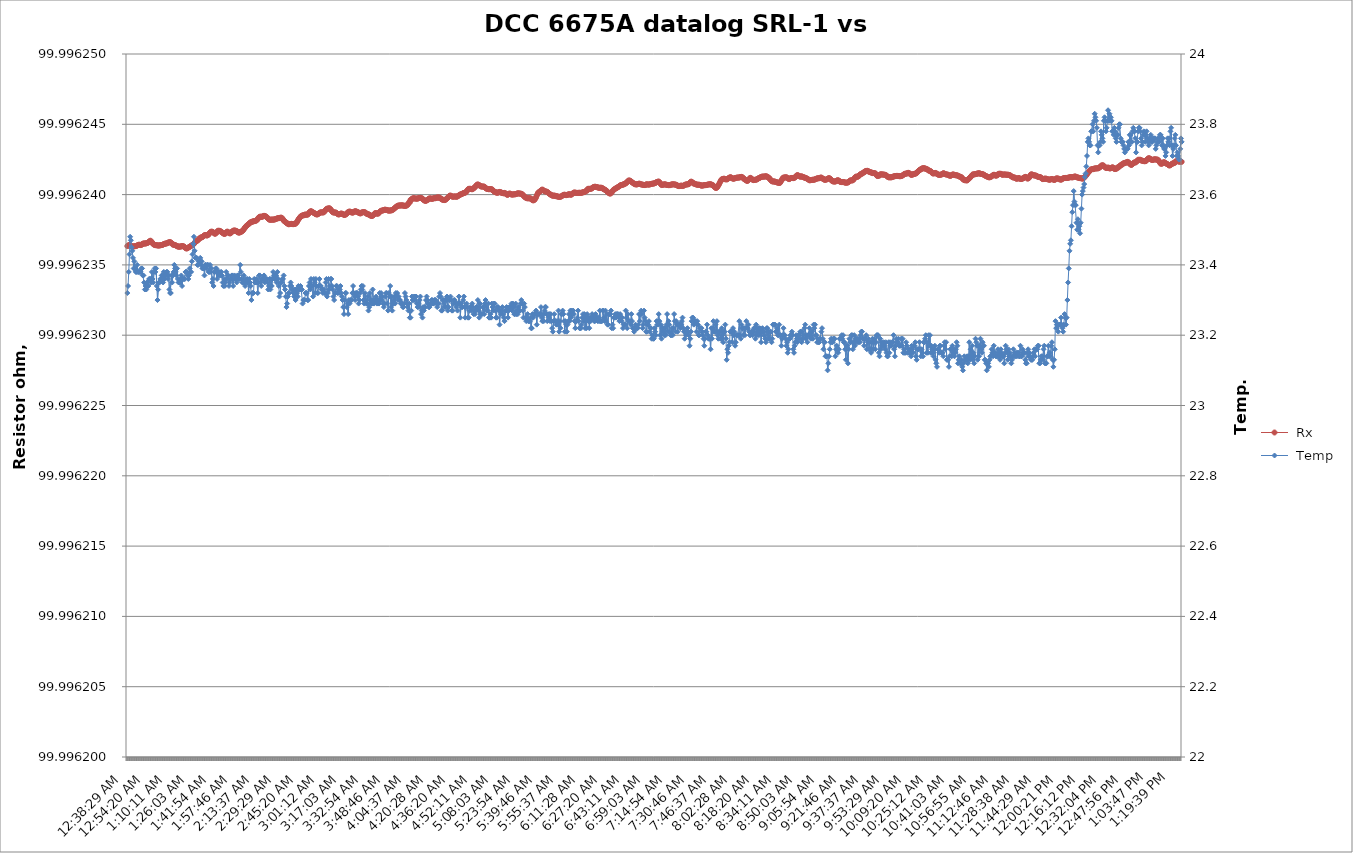
| Category |  Rx |
|---|---|
| 2021-03-07 00:38:29 | 99.996 |
| 2021-03-07 00:38:59 | 99.996 |
| 2021-03-07 00:39:30 | 99.996 |
| 2021-03-07 00:40:01 | 99.996 |
| 2021-03-07 00:40:31 | 99.996 |
| 2021-03-07 00:41:02 | 99.996 |
| 2021-03-07 00:41:33 | 99.996 |
| 2021-03-07 00:42:03 | 99.996 |
| 2021-03-07 00:42:34 | 99.996 |
| 2021-03-07 00:43:05 | 99.996 |
| 2021-03-07 00:43:35 | 99.996 |
| 2021-03-07 00:44:06 | 99.996 |
| 2021-03-07 00:44:37 | 99.996 |
| 2021-03-07 00:45:08 | 99.996 |
| 2021-03-07 00:45:38 | 99.996 |
| 2021-03-07 00:46:09 | 99.996 |
| 2021-03-07 00:46:40 | 99.996 |
| 2021-03-07 00:47:10 | 99.996 |
| 2021-03-07 00:47:41 | 99.996 |
| 2021-03-07 00:48:12 | 99.996 |
| 2021-03-07 00:48:42 | 99.996 |
| 2021-03-07 00:49:13 | 99.996 |
| 2021-03-07 00:49:44 | 99.996 |
| 2021-03-07 00:50:14 | 99.996 |
| 2021-03-07 00:50:45 | 99.996 |
| 2021-03-07 00:51:16 | 99.996 |
| 2021-03-07 00:51:47 | 99.996 |
| 2021-03-07 00:52:17 | 99.996 |
| 2021-03-07 00:52:48 | 99.996 |
| 2021-03-07 00:53:19 | 99.996 |
| 2021-03-07 00:53:49 | 99.996 |
| 2021-03-07 00:54:20 | 99.996 |
| 2021-03-07 00:54:51 | 99.996 |
| 2021-03-07 00:55:21 | 99.996 |
| 2021-03-07 00:55:52 | 99.996 |
| 2021-03-07 00:56:23 | 99.996 |
| 2021-03-07 00:56:53 | 99.996 |
| 2021-03-07 00:57:24 | 99.996 |
| 2021-03-07 00:57:55 | 99.996 |
| 2021-03-07 00:58:26 | 99.996 |
| 2021-03-07 00:58:56 | 99.996 |
| 2021-03-07 00:59:27 | 99.996 |
| 2021-03-07 00:59:58 | 99.996 |
| 2021-03-07 01:00:28 | 99.996 |
| 2021-03-07 01:00:59 | 99.996 |
| 2021-03-07 01:01:30 | 99.996 |
| 2021-03-07 01:02:00 | 99.996 |
| 2021-03-07 01:02:31 | 99.996 |
| 2021-03-07 01:03:02 | 99.996 |
| 2021-03-07 01:03:32 | 99.996 |
| 2021-03-07 01:04:03 | 99.996 |
| 2021-03-07 01:04:34 | 99.996 |
| 2021-03-07 01:05:05 | 99.996 |
| 2021-03-07 01:05:35 | 99.996 |
| 2021-03-07 01:06:06 | 99.996 |
| 2021-03-07 01:06:37 | 99.996 |
| 2021-03-07 01:07:07 | 99.996 |
| 2021-03-07 01:07:38 | 99.996 |
| 2021-03-07 01:08:09 | 99.996 |
| 2021-03-07 01:08:39 | 99.996 |
| 2021-03-07 01:09:10 | 99.996 |
| 2021-03-07 01:09:41 | 99.996 |
| 2021-03-07 01:10:11 | 99.996 |
| 2021-03-07 01:10:42 | 99.996 |
| 2021-03-07 01:11:13 | 99.996 |
| 2021-03-07 01:11:44 | 99.996 |
| 2021-03-07 01:12:14 | 99.996 |
| 2021-03-07 01:12:45 | 99.996 |
| 2021-03-07 01:13:16 | 99.996 |
| 2021-03-07 01:13:46 | 99.996 |
| 2021-03-07 01:14:17 | 99.996 |
| 2021-03-07 01:14:48 | 99.996 |
| 2021-03-07 01:15:18 | 99.996 |
| 2021-03-07 01:15:49 | 99.996 |
| 2021-03-07 01:16:20 | 99.996 |
| 2021-03-07 01:16:51 | 99.996 |
| 2021-03-07 01:17:21 | 99.996 |
| 2021-03-07 01:17:52 | 99.996 |
| 2021-03-07 01:18:23 | 99.996 |
| 2021-03-07 01:18:53 | 99.996 |
| 2021-03-07 01:19:24 | 99.996 |
| 2021-03-07 01:19:55 | 99.996 |
| 2021-03-07 01:20:25 | 99.996 |
| 2021-03-07 01:20:56 | 99.996 |
| 2021-03-07 01:21:27 | 99.996 |
| 2021-03-07 01:21:57 | 99.996 |
| 2021-03-07 01:22:28 | 99.996 |
| 2021-03-07 01:22:59 | 99.996 |
| 2021-03-07 01:23:30 | 99.996 |
| 2021-03-07 01:24:00 | 99.996 |
| 2021-03-07 01:24:31 | 99.996 |
| 2021-03-07 01:25:02 | 99.996 |
| 2021-03-07 01:25:32 | 99.996 |
| 2021-03-07 01:26:03 | 99.996 |
| 2021-03-07 01:26:34 | 99.996 |
| 2021-03-07 01:27:04 | 99.996 |
| 2021-03-07 01:27:35 | 99.996 |
| 2021-03-07 01:28:06 | 99.996 |
| 2021-03-07 01:28:36 | 99.996 |
| 2021-03-07 01:29:07 | 99.996 |
| 2021-03-07 01:29:38 | 99.996 |
| 2021-03-07 01:30:09 | 99.996 |
| 2021-03-07 01:30:39 | 99.996 |
| 2021-03-07 01:31:10 | 99.996 |
| 2021-03-07 01:31:41 | 99.996 |
| 2021-03-07 01:32:11 | 99.996 |
| 2021-03-07 01:32:42 | 99.996 |
| 2021-03-07 01:33:13 | 99.996 |
| 2021-03-07 01:33:43 | 99.996 |
| 2021-03-07 01:34:14 | 99.996 |
| 2021-03-07 01:34:45 | 99.996 |
| 2021-03-07 01:35:15 | 99.996 |
| 2021-03-07 01:35:46 | 99.996 |
| 2021-03-07 01:36:17 | 99.996 |
| 2021-03-07 01:36:48 | 99.996 |
| 2021-03-07 01:37:18 | 99.996 |
| 2021-03-07 01:37:49 | 99.996 |
| 2021-03-07 01:38:20 | 99.996 |
| 2021-03-07 01:38:50 | 99.996 |
| 2021-03-07 01:39:21 | 99.996 |
| 2021-03-07 01:39:52 | 99.996 |
| 2021-03-07 01:40:22 | 99.996 |
| 2021-03-07 01:40:53 | 99.996 |
| 2021-03-07 01:41:24 | 99.996 |
| 2021-03-07 01:41:54 | 99.996 |
| 2021-03-07 01:42:25 | 99.996 |
| 2021-03-07 01:42:56 | 99.996 |
| 2021-03-07 01:43:27 | 99.996 |
| 2021-03-07 01:43:57 | 99.996 |
| 2021-03-07 01:44:28 | 99.996 |
| 2021-03-07 01:44:59 | 99.996 |
| 2021-03-07 01:45:29 | 99.996 |
| 2021-03-07 01:46:00 | 99.996 |
| 2021-03-07 01:46:31 | 99.996 |
| 2021-03-07 01:47:01 | 99.996 |
| 2021-03-07 01:47:32 | 99.996 |
| 2021-03-07 01:48:03 | 99.996 |
| 2021-03-07 01:48:33 | 99.996 |
| 2021-03-07 01:49:04 | 99.996 |
| 2021-03-07 01:49:35 | 99.996 |
| 2021-03-07 01:50:06 | 99.996 |
| 2021-03-07 01:50:36 | 99.996 |
| 2021-03-07 01:51:07 | 99.996 |
| 2021-03-07 01:51:38 | 99.996 |
| 2021-03-07 01:52:08 | 99.996 |
| 2021-03-07 01:52:39 | 99.996 |
| 2021-03-07 01:53:10 | 99.996 |
| 2021-03-07 01:53:40 | 99.996 |
| 2021-03-07 01:54:11 | 99.996 |
| 2021-03-07 01:54:42 | 99.996 |
| 2021-03-07 01:55:12 | 99.996 |
| 2021-03-07 01:55:43 | 99.996 |
| 2021-03-07 01:56:14 | 99.996 |
| 2021-03-07 01:56:44 | 99.996 |
| 2021-03-07 01:57:15 | 99.996 |
| 2021-03-07 01:57:46 | 99.996 |
| 2021-03-07 01:58:17 | 99.996 |
| 2021-03-07 01:58:47 | 99.996 |
| 2021-03-07 01:59:18 | 99.996 |
| 2021-03-07 01:59:49 | 99.996 |
| 2021-03-07 02:00:19 | 99.996 |
| 2021-03-07 02:00:50 | 99.996 |
| 2021-03-07 02:01:21 | 99.996 |
| 2021-03-07 02:01:51 | 99.996 |
| 2021-03-07 02:02:22 | 99.996 |
| 2021-03-07 02:02:53 | 99.996 |
| 2021-03-07 02:03:23 | 99.996 |
| 2021-03-07 02:03:54 | 99.996 |
| 2021-03-07 02:04:25 | 99.996 |
| 2021-03-07 02:04:56 | 99.996 |
| 2021-03-07 02:05:26 | 99.996 |
| 2021-03-07 02:05:57 | 99.996 |
| 2021-03-07 02:06:28 | 99.996 |
| 2021-03-07 02:06:58 | 99.996 |
| 2021-03-07 02:07:29 | 99.996 |
| 2021-03-07 02:08:00 | 99.996 |
| 2021-03-07 02:08:30 | 99.996 |
| 2021-03-07 02:09:01 | 99.996 |
| 2021-03-07 02:09:32 | 99.996 |
| 2021-03-07 02:10:02 | 99.996 |
| 2021-03-07 02:10:33 | 99.996 |
| 2021-03-07 02:11:04 | 99.996 |
| 2021-03-07 02:11:35 | 99.996 |
| 2021-03-07 02:12:05 | 99.996 |
| 2021-03-07 02:12:36 | 99.996 |
| 2021-03-07 02:13:07 | 99.996 |
| 2021-03-07 02:13:37 | 99.996 |
| 2021-03-07 02:14:08 | 99.996 |
| 2021-03-07 02:14:39 | 99.996 |
| 2021-03-07 02:15:09 | 99.996 |
| 2021-03-07 02:15:40 | 99.996 |
| 2021-03-07 02:16:11 | 99.996 |
| 2021-03-07 02:16:41 | 99.996 |
| 2021-03-07 02:17:12 | 99.996 |
| 2021-03-07 02:17:43 | 99.996 |
| 2021-03-07 02:18:14 | 99.996 |
| 2021-03-07 02:18:44 | 99.996 |
| 2021-03-07 02:19:15 | 99.996 |
| 2021-03-07 02:19:46 | 99.996 |
| 2021-03-07 02:20:16 | 99.996 |
| 2021-03-07 02:20:47 | 99.996 |
| 2021-03-07 02:21:18 | 99.996 |
| 2021-03-07 02:21:48 | 99.996 |
| 2021-03-07 02:22:19 | 99.996 |
| 2021-03-07 02:22:50 | 99.996 |
| 2021-03-07 02:23:20 | 99.996 |
| 2021-03-07 02:23:51 | 99.996 |
| 2021-03-07 02:24:22 | 99.996 |
| 2021-03-07 02:24:52 | 99.996 |
| 2021-03-07 02:25:23 | 99.996 |
| 2021-03-07 02:25:54 | 99.996 |
| 2021-03-07 02:26:25 | 99.996 |
| 2021-03-07 02:26:55 | 99.996 |
| 2021-03-07 02:27:26 | 99.996 |
| 2021-03-07 02:27:57 | 99.996 |
| 2021-03-07 02:28:27 | 99.996 |
| 2021-03-07 02:28:58 | 99.996 |
| 2021-03-07 02:29:29 | 99.996 |
| 2021-03-07 02:29:59 | 99.996 |
| 2021-03-07 02:30:30 | 99.996 |
| 2021-03-07 02:31:01 | 99.996 |
| 2021-03-07 02:31:31 | 99.996 |
| 2021-03-07 02:32:02 | 99.996 |
| 2021-03-07 02:32:33 | 99.996 |
| 2021-03-07 02:33:04 | 99.996 |
| 2021-03-07 02:33:34 | 99.996 |
| 2021-03-07 02:34:05 | 99.996 |
| 2021-03-07 02:34:36 | 99.996 |
| 2021-03-07 02:35:06 | 99.996 |
| 2021-03-07 02:35:37 | 99.996 |
| 2021-03-07 02:36:08 | 99.996 |
| 2021-03-07 02:36:38 | 99.996 |
| 2021-03-07 02:37:09 | 99.996 |
| 2021-03-07 02:37:40 | 99.996 |
| 2021-03-07 02:38:10 | 99.996 |
| 2021-03-07 02:38:41 | 99.996 |
| 2021-03-07 02:39:12 | 99.996 |
| 2021-03-07 02:39:43 | 99.996 |
| 2021-03-07 02:40:13 | 99.996 |
| 2021-03-07 02:40:44 | 99.996 |
| 2021-03-07 02:41:15 | 99.996 |
| 2021-03-07 02:41:45 | 99.996 |
| 2021-03-07 02:42:16 | 99.996 |
| 2021-03-07 02:42:47 | 99.996 |
| 2021-03-07 02:43:17 | 99.996 |
| 2021-03-07 02:43:48 | 99.996 |
| 2021-03-07 02:44:19 | 99.996 |
| 2021-03-07 02:44:49 | 99.996 |
| 2021-03-07 02:45:20 | 99.996 |
| 2021-03-07 02:45:51 | 99.996 |
| 2021-03-07 02:46:22 | 99.996 |
| 2021-03-07 02:46:52 | 99.996 |
| 2021-03-07 02:47:23 | 99.996 |
| 2021-03-07 02:47:54 | 99.996 |
| 2021-03-07 02:48:24 | 99.996 |
| 2021-03-07 02:48:55 | 99.996 |
| 2021-03-07 02:49:26 | 99.996 |
| 2021-03-07 02:49:56 | 99.996 |
| 2021-03-07 02:50:27 | 99.996 |
| 2021-03-07 02:50:58 | 99.996 |
| 2021-03-07 02:51:28 | 99.996 |
| 2021-03-07 02:51:59 | 99.996 |
| 2021-03-07 02:52:30 | 99.996 |
| 2021-03-07 02:53:00 | 99.996 |
| 2021-03-07 02:53:31 | 99.996 |
| 2021-03-07 02:54:02 | 99.996 |
| 2021-03-07 02:54:33 | 99.996 |
| 2021-03-07 02:55:03 | 99.996 |
| 2021-03-07 02:55:34 | 99.996 |
| 2021-03-07 02:56:05 | 99.996 |
| 2021-03-07 02:56:35 | 99.996 |
| 2021-03-07 02:57:06 | 99.996 |
| 2021-03-07 02:57:37 | 99.996 |
| 2021-03-07 02:58:07 | 99.996 |
| 2021-03-07 02:58:38 | 99.996 |
| 2021-03-07 02:59:09 | 99.996 |
| 2021-03-07 02:59:39 | 99.996 |
| 2021-03-07 03:00:10 | 99.996 |
| 2021-03-07 03:00:41 | 99.996 |
| 2021-03-07 03:01:12 | 99.996 |
| 2021-03-07 03:01:42 | 99.996 |
| 2021-03-07 03:02:13 | 99.996 |
| 2021-03-07 03:02:44 | 99.996 |
| 2021-03-07 03:03:14 | 99.996 |
| 2021-03-07 03:03:45 | 99.996 |
| 2021-03-07 03:04:16 | 99.996 |
| 2021-03-07 03:04:46 | 99.996 |
| 2021-03-07 03:05:17 | 99.996 |
| 2021-03-07 03:05:48 | 99.996 |
| 2021-03-07 03:06:18 | 99.996 |
| 2021-03-07 03:06:49 | 99.996 |
| 2021-03-07 03:07:20 | 99.996 |
| 2021-03-07 03:07:50 | 99.996 |
| 2021-03-07 03:08:21 | 99.996 |
| 2021-03-07 03:08:52 | 99.996 |
| 2021-03-07 03:09:23 | 99.996 |
| 2021-03-07 03:09:53 | 99.996 |
| 2021-03-07 03:10:24 | 99.996 |
| 2021-03-07 03:10:55 | 99.996 |
| 2021-03-07 03:11:25 | 99.996 |
| 2021-03-07 03:11:56 | 99.996 |
| 2021-03-07 03:12:27 | 99.996 |
| 2021-03-07 03:12:57 | 99.996 |
| 2021-03-07 03:13:28 | 99.996 |
| 2021-03-07 03:13:59 | 99.996 |
| 2021-03-07 03:14:29 | 99.996 |
| 2021-03-07 03:15:00 | 99.996 |
| 2021-03-07 03:15:31 | 99.996 |
| 2021-03-07 03:16:02 | 99.996 |
| 2021-03-07 03:16:32 | 99.996 |
| 2021-03-07 03:17:03 | 99.996 |
| 2021-03-07 03:17:34 | 99.996 |
| 2021-03-07 03:18:04 | 99.996 |
| 2021-03-07 03:18:35 | 99.996 |
| 2021-03-07 03:19:06 | 99.996 |
| 2021-03-07 03:19:36 | 99.996 |
| 2021-03-07 03:20:07 | 99.996 |
| 2021-03-07 03:20:38 | 99.996 |
| 2021-03-07 03:21:08 | 99.996 |
| 2021-03-07 03:21:39 | 99.996 |
| 2021-03-07 03:22:10 | 99.996 |
| 2021-03-07 03:22:41 | 99.996 |
| 2021-03-07 03:23:11 | 99.996 |
| 2021-03-07 03:23:42 | 99.996 |
| 2021-03-07 03:24:13 | 99.996 |
| 2021-03-07 03:24:43 | 99.996 |
| 2021-03-07 03:25:14 | 99.996 |
| 2021-03-07 03:25:45 | 99.996 |
| 2021-03-07 03:26:15 | 99.996 |
| 2021-03-07 03:26:46 | 99.996 |
| 2021-03-07 03:27:17 | 99.996 |
| 2021-03-07 03:27:47 | 99.996 |
| 2021-03-07 03:28:18 | 99.996 |
| 2021-03-07 03:28:49 | 99.996 |
| 2021-03-07 03:29:19 | 99.996 |
| 2021-03-07 03:29:50 | 99.996 |
| 2021-03-07 03:30:21 | 99.996 |
| 2021-03-07 03:30:52 | 99.996 |
| 2021-03-07 03:31:22 | 99.996 |
| 2021-03-07 03:31:53 | 99.996 |
| 2021-03-07 03:32:24 | 99.996 |
| 2021-03-07 03:32:54 | 99.996 |
| 2021-03-07 03:33:25 | 99.996 |
| 2021-03-07 03:33:56 | 99.996 |
| 2021-03-07 03:34:26 | 99.996 |
| 2021-03-07 03:34:57 | 99.996 |
| 2021-03-07 03:35:28 | 99.996 |
| 2021-03-07 03:35:58 | 99.996 |
| 2021-03-07 03:36:29 | 99.996 |
| 2021-03-07 03:37:00 | 99.996 |
| 2021-03-07 03:37:30 | 99.996 |
| 2021-03-07 03:38:01 | 99.996 |
| 2021-03-07 03:38:32 | 99.996 |
| 2021-03-07 03:39:03 | 99.996 |
| 2021-03-07 03:39:33 | 99.996 |
| 2021-03-07 03:40:04 | 99.996 |
| 2021-03-07 03:40:35 | 99.996 |
| 2021-03-07 03:41:05 | 99.996 |
| 2021-03-07 03:41:36 | 99.996 |
| 2021-03-07 03:42:07 | 99.996 |
| 2021-03-07 03:42:37 | 99.996 |
| 2021-03-07 03:43:08 | 99.996 |
| 2021-03-07 03:43:39 | 99.996 |
| 2021-03-07 03:44:09 | 99.996 |
| 2021-03-07 03:44:40 | 99.996 |
| 2021-03-07 03:45:11 | 99.996 |
| 2021-03-07 03:45:42 | 99.996 |
| 2021-03-07 03:46:12 | 99.996 |
| 2021-03-07 03:46:43 | 99.996 |
| 2021-03-07 03:47:14 | 99.996 |
| 2021-03-07 03:47:44 | 99.996 |
| 2021-03-07 03:48:15 | 99.996 |
| 2021-03-07 03:48:46 | 99.996 |
| 2021-03-07 03:49:16 | 99.996 |
| 2021-03-07 03:49:47 | 99.996 |
| 2021-03-07 03:50:18 | 99.996 |
| 2021-03-07 03:50:48 | 99.996 |
| 2021-03-07 03:51:19 | 99.996 |
| 2021-03-07 03:51:50 | 99.996 |
| 2021-03-07 03:52:20 | 99.996 |
| 2021-03-07 03:52:51 | 99.996 |
| 2021-03-07 03:53:22 | 99.996 |
| 2021-03-07 03:53:53 | 99.996 |
| 2021-03-07 03:54:23 | 99.996 |
| 2021-03-07 03:54:54 | 99.996 |
| 2021-03-07 03:55:25 | 99.996 |
| 2021-03-07 03:55:55 | 99.996 |
| 2021-03-07 03:56:26 | 99.996 |
| 2021-03-07 03:56:57 | 99.996 |
| 2021-03-07 03:57:27 | 99.996 |
| 2021-03-07 03:57:58 | 99.996 |
| 2021-03-07 03:58:29 | 99.996 |
| 2021-03-07 03:58:59 | 99.996 |
| 2021-03-07 03:59:30 | 99.996 |
| 2021-03-07 04:00:01 | 99.996 |
| 2021-03-07 04:00:32 | 99.996 |
| 2021-03-07 04:01:02 | 99.996 |
| 2021-03-07 04:01:33 | 99.996 |
| 2021-03-07 04:02:04 | 99.996 |
| 2021-03-07 04:02:34 | 99.996 |
| 2021-03-07 04:03:05 | 99.996 |
| 2021-03-07 04:03:36 | 99.996 |
| 2021-03-07 04:04:06 | 99.996 |
| 2021-03-07 04:04:37 | 99.996 |
| 2021-03-07 04:05:08 | 99.996 |
| 2021-03-07 04:05:38 | 99.996 |
| 2021-03-07 04:06:09 | 99.996 |
| 2021-03-07 04:06:40 | 99.996 |
| 2021-03-07 04:07:11 | 99.996 |
| 2021-03-07 04:07:41 | 99.996 |
| 2021-03-07 04:08:12 | 99.996 |
| 2021-03-07 04:08:43 | 99.996 |
| 2021-03-07 04:09:13 | 99.996 |
| 2021-03-07 04:09:44 | 99.996 |
| 2021-03-07 04:10:15 | 99.996 |
| 2021-03-07 04:10:45 | 99.996 |
| 2021-03-07 04:11:16 | 99.996 |
| 2021-03-07 04:11:47 | 99.996 |
| 2021-03-07 04:12:17 | 99.996 |
| 2021-03-07 04:12:48 | 99.996 |
| 2021-03-07 04:13:19 | 99.996 |
| 2021-03-07 04:13:50 | 99.996 |
| 2021-03-07 04:14:20 | 99.996 |
| 2021-03-07 04:14:51 | 99.996 |
| 2021-03-07 04:15:22 | 99.996 |
| 2021-03-07 04:15:52 | 99.996 |
| 2021-03-07 04:16:23 | 99.996 |
| 2021-03-07 04:16:54 | 99.996 |
| 2021-03-07 04:17:24 | 99.996 |
| 2021-03-07 04:17:55 | 99.996 |
| 2021-03-07 04:18:26 | 99.996 |
| 2021-03-07 04:18:56 | 99.996 |
| 2021-03-07 04:19:27 | 99.996 |
| 2021-03-07 04:19:58 | 99.996 |
| 2021-03-07 04:20:28 | 99.996 |
| 2021-03-07 04:20:59 | 99.996 |
| 2021-03-07 04:21:30 | 99.996 |
| 2021-03-07 04:22:01 | 99.996 |
| 2021-03-07 04:22:31 | 99.996 |
| 2021-03-07 04:23:02 | 99.996 |
| 2021-03-07 04:23:33 | 99.996 |
| 2021-03-07 04:24:03 | 99.996 |
| 2021-03-07 04:24:34 | 99.996 |
| 2021-03-07 04:25:05 | 99.996 |
| 2021-03-07 04:25:35 | 99.996 |
| 2021-03-07 04:26:06 | 99.996 |
| 2021-03-07 04:26:37 | 99.996 |
| 2021-03-07 04:27:07 | 99.996 |
| 2021-03-07 04:27:38 | 99.996 |
| 2021-03-07 04:28:09 | 99.996 |
| 2021-03-07 04:28:40 | 99.996 |
| 2021-03-07 04:29:10 | 99.996 |
| 2021-03-07 04:29:41 | 99.996 |
| 2021-03-07 04:30:12 | 99.996 |
| 2021-03-07 04:30:42 | 99.996 |
| 2021-03-07 04:31:13 | 99.996 |
| 2021-03-07 04:31:44 | 99.996 |
| 2021-03-07 04:32:14 | 99.996 |
| 2021-03-07 04:32:45 | 99.996 |
| 2021-03-07 04:33:16 | 99.996 |
| 2021-03-07 04:33:46 | 99.996 |
| 2021-03-07 04:34:17 | 99.996 |
| 2021-03-07 04:34:48 | 99.996 |
| 2021-03-07 04:35:18 | 99.996 |
| 2021-03-07 04:35:49 | 99.996 |
| 2021-03-07 04:36:20 | 99.996 |
| 2021-03-07 04:36:51 | 99.996 |
| 2021-03-07 04:37:21 | 99.996 |
| 2021-03-07 04:37:52 | 99.996 |
| 2021-03-07 04:38:23 | 99.996 |
| 2021-03-07 04:38:53 | 99.996 |
| 2021-03-07 04:39:24 | 99.996 |
| 2021-03-07 04:39:55 | 99.996 |
| 2021-03-07 04:40:25 | 99.996 |
| 2021-03-07 04:40:56 | 99.996 |
| 2021-03-07 04:41:27 | 99.996 |
| 2021-03-07 04:41:57 | 99.996 |
| 2021-03-07 04:42:28 | 99.996 |
| 2021-03-07 04:42:59 | 99.996 |
| 2021-03-07 04:43:30 | 99.996 |
| 2021-03-07 04:44:00 | 99.996 |
| 2021-03-07 04:44:31 | 99.996 |
| 2021-03-07 04:45:02 | 99.996 |
| 2021-03-07 04:45:32 | 99.996 |
| 2021-03-07 04:46:03 | 99.996 |
| 2021-03-07 04:46:34 | 99.996 |
| 2021-03-07 04:47:04 | 99.996 |
| 2021-03-07 04:47:35 | 99.996 |
| 2021-03-07 04:48:06 | 99.996 |
| 2021-03-07 04:48:36 | 99.996 |
| 2021-03-07 04:49:07 | 99.996 |
| 2021-03-07 04:49:38 | 99.996 |
| 2021-03-07 04:50:09 | 99.996 |
| 2021-03-07 04:50:39 | 99.996 |
| 2021-03-07 04:51:10 | 99.996 |
| 2021-03-07 04:51:41 | 99.996 |
| 2021-03-07 04:52:11 | 99.996 |
| 2021-03-07 04:52:42 | 99.996 |
| 2021-03-07 04:53:13 | 99.996 |
| 2021-03-07 04:53:43 | 99.996 |
| 2021-03-07 04:54:14 | 99.996 |
| 2021-03-07 04:54:45 | 99.996 |
| 2021-03-07 04:55:15 | 99.996 |
| 2021-03-07 04:55:46 | 99.996 |
| 2021-03-07 04:56:17 | 99.996 |
| 2021-03-07 04:56:48 | 99.996 |
| 2021-03-07 04:57:18 | 99.996 |
| 2021-03-07 04:57:49 | 99.996 |
| 2021-03-07 04:58:20 | 99.996 |
| 2021-03-07 04:58:50 | 99.996 |
| 2021-03-07 04:59:21 | 99.996 |
| 2021-03-07 04:59:52 | 99.996 |
| 2021-03-07 05:00:22 | 99.996 |
| 2021-03-07 05:00:53 | 99.996 |
| 2021-03-07 05:01:24 | 99.996 |
| 2021-03-07 05:01:54 | 99.996 |
| 2021-03-07 05:02:25 | 99.996 |
| 2021-03-07 05:02:56 | 99.996 |
| 2021-03-07 05:03:27 | 99.996 |
| 2021-03-07 05:03:57 | 99.996 |
| 2021-03-07 05:04:28 | 99.996 |
| 2021-03-07 05:04:59 | 99.996 |
| 2021-03-07 05:05:29 | 99.996 |
| 2021-03-07 05:06:00 | 99.996 |
| 2021-03-07 05:06:31 | 99.996 |
| 2021-03-07 05:07:01 | 99.996 |
| 2021-03-07 05:07:32 | 99.996 |
| 2021-03-07 05:08:03 | 99.996 |
| 2021-03-07 05:08:33 | 99.996 |
| 2021-03-07 05:09:04 | 99.996 |
| 2021-03-07 05:09:35 | 99.996 |
| 2021-03-07 05:10:05 | 99.996 |
| 2021-03-07 05:10:36 | 99.996 |
| 2021-03-07 05:11:07 | 99.996 |
| 2021-03-07 05:11:38 | 99.996 |
| 2021-03-07 05:12:08 | 99.996 |
| 2021-03-07 05:12:39 | 99.996 |
| 2021-03-07 05:13:10 | 99.996 |
| 2021-03-07 05:13:40 | 99.996 |
| 2021-03-07 05:14:11 | 99.996 |
| 2021-03-07 05:14:42 | 99.996 |
| 2021-03-07 05:15:12 | 99.996 |
| 2021-03-07 05:15:43 | 99.996 |
| 2021-03-07 05:16:14 | 99.996 |
| 2021-03-07 05:16:44 | 99.996 |
| 2021-03-07 05:17:15 | 99.996 |
| 2021-03-07 05:17:46 | 99.996 |
| 2021-03-07 05:18:17 | 99.996 |
| 2021-03-07 05:18:47 | 99.996 |
| 2021-03-07 05:19:18 | 99.996 |
| 2021-03-07 05:19:49 | 99.996 |
| 2021-03-07 05:20:19 | 99.996 |
| 2021-03-07 05:20:50 | 99.996 |
| 2021-03-07 05:21:21 | 99.996 |
| 2021-03-07 05:21:51 | 99.996 |
| 2021-03-07 05:22:22 | 99.996 |
| 2021-03-07 05:22:53 | 99.996 |
| 2021-03-07 05:23:23 | 99.996 |
| 2021-03-07 05:23:54 | 99.996 |
| 2021-03-07 05:24:25 | 99.996 |
| 2021-03-07 05:24:56 | 99.996 |
| 2021-03-07 05:25:26 | 99.996 |
| 2021-03-07 05:25:57 | 99.996 |
| 2021-03-07 05:26:28 | 99.996 |
| 2021-03-07 05:26:58 | 99.996 |
| 2021-03-07 05:27:29 | 99.996 |
| 2021-03-07 05:28:00 | 99.996 |
| 2021-03-07 05:28:30 | 99.996 |
| 2021-03-07 05:29:01 | 99.996 |
| 2021-03-07 05:29:32 | 99.996 |
| 2021-03-07 05:30:02 | 99.996 |
| 2021-03-07 05:30:33 | 99.996 |
| 2021-03-07 05:31:04 | 99.996 |
| 2021-03-07 05:31:34 | 99.996 |
| 2021-03-07 05:32:05 | 99.996 |
| 2021-03-07 05:32:36 | 99.996 |
| 2021-03-07 05:33:07 | 99.996 |
| 2021-03-07 05:33:37 | 99.996 |
| 2021-03-07 05:34:08 | 99.996 |
| 2021-03-07 05:34:39 | 99.996 |
| 2021-03-07 05:35:09 | 99.996 |
| 2021-03-07 05:35:40 | 99.996 |
| 2021-03-07 05:36:11 | 99.996 |
| 2021-03-07 05:36:41 | 99.996 |
| 2021-03-07 05:37:12 | 99.996 |
| 2021-03-07 05:37:43 | 99.996 |
| 2021-03-07 05:38:13 | 99.996 |
| 2021-03-07 05:38:44 | 99.996 |
| 2021-03-07 05:39:15 | 99.996 |
| 2021-03-07 05:39:46 | 99.996 |
| 2021-03-07 05:40:16 | 99.996 |
| 2021-03-07 05:40:47 | 99.996 |
| 2021-03-07 05:41:18 | 99.996 |
| 2021-03-07 05:41:48 | 99.996 |
| 2021-03-07 05:42:19 | 99.996 |
| 2021-03-07 05:42:50 | 99.996 |
| 2021-03-07 05:43:20 | 99.996 |
| 2021-03-07 05:43:51 | 99.996 |
| 2021-03-07 05:44:22 | 99.996 |
| 2021-03-07 05:44:52 | 99.996 |
| 2021-03-07 05:45:23 | 99.996 |
| 2021-03-07 05:45:54 | 99.996 |
| 2021-03-07 05:46:24 | 99.996 |
| 2021-03-07 05:46:55 | 99.996 |
| 2021-03-07 05:47:26 | 99.996 |
| 2021-03-07 05:47:57 | 99.996 |
| 2021-03-07 05:48:27 | 99.996 |
| 2021-03-07 05:48:58 | 99.996 |
| 2021-03-07 05:49:29 | 99.996 |
| 2021-03-07 05:49:59 | 99.996 |
| 2021-03-07 05:50:30 | 99.996 |
| 2021-03-07 05:51:01 | 99.996 |
| 2021-03-07 05:51:31 | 99.996 |
| 2021-03-07 05:52:02 | 99.996 |
| 2021-03-07 05:52:33 | 99.996 |
| 2021-03-07 05:53:03 | 99.996 |
| 2021-03-07 05:53:34 | 99.996 |
| 2021-03-07 05:54:05 | 99.996 |
| 2021-03-07 05:54:36 | 99.996 |
| 2021-03-07 05:55:06 | 99.996 |
| 2021-03-07 05:55:37 | 99.996 |
| 2021-03-07 05:56:08 | 99.996 |
| 2021-03-07 05:56:38 | 99.996 |
| 2021-03-07 05:57:09 | 99.996 |
| 2021-03-07 05:57:40 | 99.996 |
| 2021-03-07 05:58:10 | 99.996 |
| 2021-03-07 05:58:41 | 99.996 |
| 2021-03-07 05:59:12 | 99.996 |
| 2021-03-07 05:59:42 | 99.996 |
| 2021-03-07 06:00:13 | 99.996 |
| 2021-03-07 06:00:44 | 99.996 |
| 2021-03-07 06:01:14 | 99.996 |
| 2021-03-07 06:01:45 | 99.996 |
| 2021-03-07 06:02:16 | 99.996 |
| 2021-03-07 06:02:47 | 99.996 |
| 2021-03-07 06:03:17 | 99.996 |
| 2021-03-07 06:03:48 | 99.996 |
| 2021-03-07 06:04:19 | 99.996 |
| 2021-03-07 06:04:49 | 99.996 |
| 2021-03-07 06:05:20 | 99.996 |
| 2021-03-07 06:05:51 | 99.996 |
| 2021-03-07 06:06:21 | 99.996 |
| 2021-03-07 06:06:52 | 99.996 |
| 2021-03-07 06:07:23 | 99.996 |
| 2021-03-07 06:07:53 | 99.996 |
| 2021-03-07 06:08:24 | 99.996 |
| 2021-03-07 06:08:55 | 99.996 |
| 2021-03-07 06:09:26 | 99.996 |
| 2021-03-07 06:09:56 | 99.996 |
| 2021-03-07 06:10:27 | 99.996 |
| 2021-03-07 06:10:58 | 99.996 |
| 2021-03-07 06:11:28 | 99.996 |
| 2021-03-07 06:11:59 | 99.996 |
| 2021-03-07 06:12:30 | 99.996 |
| 2021-03-07 06:13:00 | 99.996 |
| 2021-03-07 06:13:31 | 99.996 |
| 2021-03-07 06:14:02 | 99.996 |
| 2021-03-07 06:14:32 | 99.996 |
| 2021-03-07 06:15:03 | 99.996 |
| 2021-03-07 06:15:34 | 99.996 |
| 2021-03-07 06:16:04 | 99.996 |
| 2021-03-07 06:16:35 | 99.996 |
| 2021-03-07 06:17:06 | 99.996 |
| 2021-03-07 06:17:37 | 99.996 |
| 2021-03-07 06:18:07 | 99.996 |
| 2021-03-07 06:18:38 | 99.996 |
| 2021-03-07 06:19:09 | 99.996 |
| 2021-03-07 06:19:39 | 99.996 |
| 2021-03-07 06:20:10 | 99.996 |
| 2021-03-07 06:20:41 | 99.996 |
| 2021-03-07 06:21:11 | 99.996 |
| 2021-03-07 06:21:42 | 99.996 |
| 2021-03-07 06:22:13 | 99.996 |
| 2021-03-07 06:22:43 | 99.996 |
| 2021-03-07 06:23:14 | 99.996 |
| 2021-03-07 06:23:45 | 99.996 |
| 2021-03-07 06:24:16 | 99.996 |
| 2021-03-07 06:24:46 | 99.996 |
| 2021-03-07 06:25:17 | 99.996 |
| 2021-03-07 06:25:48 | 99.996 |
| 2021-03-07 06:26:18 | 99.996 |
| 2021-03-07 06:26:49 | 99.996 |
| 2021-03-07 06:27:20 | 99.996 |
| 2021-03-07 06:27:50 | 99.996 |
| 2021-03-07 06:28:21 | 99.996 |
| 2021-03-07 06:28:52 | 99.996 |
| 2021-03-07 06:29:22 | 99.996 |
| 2021-03-07 06:29:53 | 99.996 |
| 2021-03-07 06:30:24 | 99.996 |
| 2021-03-07 06:30:55 | 99.996 |
| 2021-03-07 06:31:25 | 99.996 |
| 2021-03-07 06:31:56 | 99.996 |
| 2021-03-07 06:32:27 | 99.996 |
| 2021-03-07 06:32:57 | 99.996 |
| 2021-03-07 06:33:28 | 99.996 |
| 2021-03-07 06:33:59 | 99.996 |
| 2021-03-07 06:34:29 | 99.996 |
| 2021-03-07 06:35:00 | 99.996 |
| 2021-03-07 06:35:31 | 99.996 |
| 2021-03-07 06:36:01 | 99.996 |
| 2021-03-07 06:36:32 | 99.996 |
| 2021-03-07 06:37:03 | 99.996 |
| 2021-03-07 06:37:34 | 99.996 |
| 2021-03-07 06:38:04 | 99.996 |
| 2021-03-07 06:38:35 | 99.996 |
| 2021-03-07 06:39:06 | 99.996 |
| 2021-03-07 06:39:36 | 99.996 |
| 2021-03-07 06:40:07 | 99.996 |
| 2021-03-07 06:40:38 | 99.996 |
| 2021-03-07 06:41:08 | 99.996 |
| 2021-03-07 06:41:39 | 99.996 |
| 2021-03-07 06:42:10 | 99.996 |
| 2021-03-07 06:42:40 | 99.996 |
| 2021-03-07 06:43:11 | 99.996 |
| 2021-03-07 06:43:42 | 99.996 |
| 2021-03-07 06:44:13 | 99.996 |
| 2021-03-07 06:44:43 | 99.996 |
| 2021-03-07 06:45:14 | 99.996 |
| 2021-03-07 06:45:45 | 99.996 |
| 2021-03-07 06:46:15 | 99.996 |
| 2021-03-07 06:46:46 | 99.996 |
| 2021-03-07 06:47:17 | 99.996 |
| 2021-03-07 06:47:47 | 99.996 |
| 2021-03-07 06:48:18 | 99.996 |
| 2021-03-07 06:48:49 | 99.996 |
| 2021-03-07 06:49:19 | 99.996 |
| 2021-03-07 06:49:50 | 99.996 |
| 2021-03-07 06:50:21 | 99.996 |
| 2021-03-07 06:50:52 | 99.996 |
| 2021-03-07 06:51:22 | 99.996 |
| 2021-03-07 06:51:53 | 99.996 |
| 2021-03-07 06:52:24 | 99.996 |
| 2021-03-07 06:52:54 | 99.996 |
| 2021-03-07 06:53:25 | 99.996 |
| 2021-03-07 06:53:56 | 99.996 |
| 2021-03-07 06:54:26 | 99.996 |
| 2021-03-07 06:54:57 | 99.996 |
| 2021-03-07 06:55:28 | 99.996 |
| 2021-03-07 06:55:58 | 99.996 |
| 2021-03-07 06:56:29 | 99.996 |
| 2021-03-07 06:57:00 | 99.996 |
| 2021-03-07 06:57:31 | 99.996 |
| 2021-03-07 06:58:01 | 99.996 |
| 2021-03-07 06:58:32 | 99.996 |
| 2021-03-07 06:59:03 | 99.996 |
| 2021-03-07 06:59:33 | 99.996 |
| 2021-03-07 07:00:04 | 99.996 |
| 2021-03-07 07:00:35 | 99.996 |
| 2021-03-07 07:01:05 | 99.996 |
| 2021-03-07 07:01:36 | 99.996 |
| 2021-03-07 07:02:07 | 99.996 |
| 2021-03-07 07:02:37 | 99.996 |
| 2021-03-07 07:03:08 | 99.996 |
| 2021-03-07 07:03:39 | 99.996 |
| 2021-03-07 07:04:10 | 99.996 |
| 2021-03-07 07:04:40 | 99.996 |
| 2021-03-07 07:05:11 | 99.996 |
| 2021-03-07 07:05:42 | 99.996 |
| 2021-03-07 07:06:12 | 99.996 |
| 2021-03-07 07:06:43 | 99.996 |
| 2021-03-07 07:07:14 | 99.996 |
| 2021-03-07 07:07:44 | 99.996 |
| 2021-03-07 07:08:15 | 99.996 |
| 2021-03-07 07:08:46 | 99.996 |
| 2021-03-07 07:09:16 | 99.996 |
| 2021-03-07 07:09:47 | 99.996 |
| 2021-03-07 07:10:18 | 99.996 |
| 2021-03-07 07:10:48 | 99.996 |
| 2021-03-07 07:11:19 | 99.996 |
| 2021-03-07 07:11:50 | 99.996 |
| 2021-03-07 07:12:21 | 99.996 |
| 2021-03-07 07:12:51 | 99.996 |
| 2021-03-07 07:13:22 | 99.996 |
| 2021-03-07 07:13:53 | 99.996 |
| 2021-03-07 07:14:23 | 99.996 |
| 2021-03-07 07:14:54 | 99.996 |
| 2021-03-07 07:15:25 | 99.996 |
| 2021-03-07 07:15:55 | 99.996 |
| 2021-03-07 07:16:26 | 99.996 |
| 2021-03-07 07:16:57 | 99.996 |
| 2021-03-07 07:17:28 | 99.996 |
| 2021-03-07 07:17:58 | 99.996 |
| 2021-03-07 07:18:29 | 99.996 |
| 2021-03-07 07:19:00 | 99.996 |
| 2021-03-07 07:19:30 | 99.996 |
| 2021-03-07 07:20:01 | 99.996 |
| 2021-03-07 07:20:32 | 99.996 |
| 2021-03-07 07:21:02 | 99.996 |
| 2021-03-07 07:21:33 | 99.996 |
| 2021-03-07 07:22:04 | 99.996 |
| 2021-03-07 07:22:34 | 99.996 |
| 2021-03-07 07:23:05 | 99.996 |
| 2021-03-07 07:23:36 | 99.996 |
| 2021-03-07 07:24:07 | 99.996 |
| 2021-03-07 07:24:37 | 99.996 |
| 2021-03-07 07:25:08 | 99.996 |
| 2021-03-07 07:25:39 | 99.996 |
| 2021-03-07 07:26:09 | 99.996 |
| 2021-03-07 07:26:40 | 99.996 |
| 2021-03-07 07:27:11 | 99.996 |
| 2021-03-07 07:27:41 | 99.996 |
| 2021-03-07 07:28:12 | 99.996 |
| 2021-03-07 07:28:43 | 99.996 |
| 2021-03-07 07:29:13 | 99.996 |
| 2021-03-07 07:29:44 | 99.996 |
| 2021-03-07 07:30:15 | 99.996 |
| 2021-03-07 07:30:46 | 99.996 |
| 2021-03-07 07:31:16 | 99.996 |
| 2021-03-07 07:31:47 | 99.996 |
| 2021-03-07 07:32:18 | 99.996 |
| 2021-03-07 07:32:48 | 99.996 |
| 2021-03-07 07:33:19 | 99.996 |
| 2021-03-07 07:33:50 | 99.996 |
| 2021-03-07 07:34:20 | 99.996 |
| 2021-03-07 07:34:51 | 99.996 |
| 2021-03-07 07:35:22 | 99.996 |
| 2021-03-07 07:35:52 | 99.996 |
| 2021-03-07 07:36:23 | 99.996 |
| 2021-03-07 07:36:54 | 99.996 |
| 2021-03-07 07:37:25 | 99.996 |
| 2021-03-07 07:37:55 | 99.996 |
| 2021-03-07 07:38:26 | 99.996 |
| 2021-03-07 07:38:57 | 99.996 |
| 2021-03-07 07:39:27 | 99.996 |
| 2021-03-07 07:39:58 | 99.996 |
| 2021-03-07 07:40:29 | 99.996 |
| 2021-03-07 07:40:59 | 99.996 |
| 2021-03-07 07:41:30 | 99.996 |
| 2021-03-07 07:42:01 | 99.996 |
| 2021-03-07 07:42:31 | 99.996 |
| 2021-03-07 07:43:02 | 99.996 |
| 2021-03-07 07:43:33 | 99.996 |
| 2021-03-07 07:44:04 | 99.996 |
| 2021-03-07 07:44:34 | 99.996 |
| 2021-03-07 07:45:05 | 99.996 |
| 2021-03-07 07:45:36 | 99.996 |
| 2021-03-07 07:46:06 | 99.996 |
| 2021-03-07 07:46:37 | 99.996 |
| 2021-03-07 07:47:08 | 99.996 |
| 2021-03-07 07:47:38 | 99.996 |
| 2021-03-07 07:48:09 | 99.996 |
| 2021-03-07 07:48:40 | 99.996 |
| 2021-03-07 07:49:10 | 99.996 |
| 2021-03-07 07:49:41 | 99.996 |
| 2021-03-07 07:50:12 | 99.996 |
| 2021-03-07 07:50:42 | 99.996 |
| 2021-03-07 07:51:13 | 99.996 |
| 2021-03-07 07:51:44 | 99.996 |
| 2021-03-07 07:52:15 | 99.996 |
| 2021-03-07 07:52:45 | 99.996 |
| 2021-03-07 07:53:16 | 99.996 |
| 2021-03-07 07:53:47 | 99.996 |
| 2021-03-07 07:54:17 | 99.996 |
| 2021-03-07 07:54:48 | 99.996 |
| 2021-03-07 07:55:19 | 99.996 |
| 2021-03-07 07:55:49 | 99.996 |
| 2021-03-07 07:56:20 | 99.996 |
| 2021-03-07 07:56:51 | 99.996 |
| 2021-03-07 07:57:21 | 99.996 |
| 2021-03-07 07:57:52 | 99.996 |
| 2021-03-07 07:58:23 | 99.996 |
| 2021-03-07 07:58:54 | 99.996 |
| 2021-03-07 07:59:24 | 99.996 |
| 2021-03-07 07:59:55 | 99.996 |
| 2021-03-07 08:00:26 | 99.996 |
| 2021-03-07 08:00:56 | 99.996 |
| 2021-03-07 08:01:27 | 99.996 |
| 2021-03-07 08:01:58 | 99.996 |
| 2021-03-07 08:02:28 | 99.996 |
| 2021-03-07 08:02:59 | 99.996 |
| 2021-03-07 08:03:30 | 99.996 |
| 2021-03-07 08:04:01 | 99.996 |
| 2021-03-07 08:04:31 | 99.996 |
| 2021-03-07 08:05:02 | 99.996 |
| 2021-03-07 08:05:33 | 99.996 |
| 2021-03-07 08:06:03 | 99.996 |
| 2021-03-07 08:06:34 | 99.996 |
| 2021-03-07 08:07:05 | 99.996 |
| 2021-03-07 08:07:35 | 99.996 |
| 2021-03-07 08:08:06 | 99.996 |
| 2021-03-07 08:08:37 | 99.996 |
| 2021-03-07 08:09:07 | 99.996 |
| 2021-03-07 08:09:38 | 99.996 |
| 2021-03-07 08:10:09 | 99.996 |
| 2021-03-07 08:10:39 | 99.996 |
| 2021-03-07 08:11:10 | 99.996 |
| 2021-03-07 08:11:41 | 99.996 |
| 2021-03-07 08:12:12 | 99.996 |
| 2021-03-07 08:12:42 | 99.996 |
| 2021-03-07 08:13:13 | 99.996 |
| 2021-03-07 08:13:44 | 99.996 |
| 2021-03-07 08:14:14 | 99.996 |
| 2021-03-07 08:14:45 | 99.996 |
| 2021-03-07 08:15:16 | 99.996 |
| 2021-03-07 08:15:46 | 99.996 |
| 2021-03-07 08:16:17 | 99.996 |
| 2021-03-07 08:16:48 | 99.996 |
| 2021-03-07 08:17:19 | 99.996 |
| 2021-03-07 08:17:49 | 99.996 |
| 2021-03-07 08:18:20 | 99.996 |
| 2021-03-07 08:18:51 | 99.996 |
| 2021-03-07 08:19:21 | 99.996 |
| 2021-03-07 08:19:52 | 99.996 |
| 2021-03-07 08:20:23 | 99.996 |
| 2021-03-07 08:20:53 | 99.996 |
| 2021-03-07 08:21:24 | 99.996 |
| 2021-03-07 08:21:55 | 99.996 |
| 2021-03-07 08:22:25 | 99.996 |
| 2021-03-07 08:22:56 | 99.996 |
| 2021-03-07 08:23:27 | 99.996 |
| 2021-03-07 08:23:57 | 99.996 |
| 2021-03-07 08:24:28 | 99.996 |
| 2021-03-07 08:24:59 | 99.996 |
| 2021-03-07 08:25:30 | 99.996 |
| 2021-03-07 08:26:00 | 99.996 |
| 2021-03-07 08:26:31 | 99.996 |
| 2021-03-07 08:27:02 | 99.996 |
| 2021-03-07 08:27:32 | 99.996 |
| 2021-03-07 08:28:03 | 99.996 |
| 2021-03-07 08:28:34 | 99.996 |
| 2021-03-07 08:29:04 | 99.996 |
| 2021-03-07 08:29:35 | 99.996 |
| 2021-03-07 08:30:06 | 99.996 |
| 2021-03-07 08:30:36 | 99.996 |
| 2021-03-07 08:31:07 | 99.996 |
| 2021-03-07 08:31:38 | 99.996 |
| 2021-03-07 08:32:09 | 99.996 |
| 2021-03-07 08:32:39 | 99.996 |
| 2021-03-07 08:33:10 | 99.996 |
| 2021-03-07 08:33:41 | 99.996 |
| 2021-03-07 08:34:11 | 99.996 |
| 2021-03-07 08:34:42 | 99.996 |
| 2021-03-07 08:35:13 | 99.996 |
| 2021-03-07 08:35:43 | 99.996 |
| 2021-03-07 08:36:14 | 99.996 |
| 2021-03-07 08:36:45 | 99.996 |
| 2021-03-07 08:37:15 | 99.996 |
| 2021-03-07 08:37:46 | 99.996 |
| 2021-03-07 08:38:17 | 99.996 |
| 2021-03-07 08:38:48 | 99.996 |
| 2021-03-07 08:39:18 | 99.996 |
| 2021-03-07 08:39:49 | 99.996 |
| 2021-03-07 08:40:20 | 99.996 |
| 2021-03-07 08:40:50 | 99.996 |
| 2021-03-07 08:41:21 | 99.996 |
| 2021-03-07 08:41:52 | 99.996 |
| 2021-03-07 08:42:22 | 99.996 |
| 2021-03-07 08:42:53 | 99.996 |
| 2021-03-07 08:43:24 | 99.996 |
| 2021-03-07 08:43:54 | 99.996 |
| 2021-03-07 08:44:25 | 99.996 |
| 2021-03-07 08:44:56 | 99.996 |
| 2021-03-07 08:45:27 | 99.996 |
| 2021-03-07 08:45:57 | 99.996 |
| 2021-03-07 08:46:28 | 99.996 |
| 2021-03-07 08:46:59 | 99.996 |
| 2021-03-07 08:47:29 | 99.996 |
| 2021-03-07 08:48:00 | 99.996 |
| 2021-03-07 08:48:31 | 99.996 |
| 2021-03-07 08:49:01 | 99.996 |
| 2021-03-07 08:49:32 | 99.996 |
| 2021-03-07 08:50:03 | 99.996 |
| 2021-03-07 08:50:33 | 99.996 |
| 2021-03-07 08:51:04 | 99.996 |
| 2021-03-07 08:51:35 | 99.996 |
| 2021-03-07 08:52:06 | 99.996 |
| 2021-03-07 08:52:36 | 99.996 |
| 2021-03-07 08:53:07 | 99.996 |
| 2021-03-07 08:53:38 | 99.996 |
| 2021-03-07 08:54:08 | 99.996 |
| 2021-03-07 08:54:39 | 99.996 |
| 2021-03-07 08:55:10 | 99.996 |
| 2021-03-07 08:55:40 | 99.996 |
| 2021-03-07 08:56:11 | 99.996 |
| 2021-03-07 08:56:42 | 99.996 |
| 2021-03-07 08:57:12 | 99.996 |
| 2021-03-07 08:57:43 | 99.996 |
| 2021-03-07 08:58:14 | 99.996 |
| 2021-03-07 08:58:45 | 99.996 |
| 2021-03-07 08:59:15 | 99.996 |
| 2021-03-07 08:59:46 | 99.996 |
| 2021-03-07 09:00:17 | 99.996 |
| 2021-03-07 09:00:47 | 99.996 |
| 2021-03-07 09:01:18 | 99.996 |
| 2021-03-07 09:01:49 | 99.996 |
| 2021-03-07 09:02:19 | 99.996 |
| 2021-03-07 09:02:50 | 99.996 |
| 2021-03-07 09:03:21 | 99.996 |
| 2021-03-07 09:03:51 | 99.996 |
| 2021-03-07 09:04:22 | 99.996 |
| 2021-03-07 09:04:53 | 99.996 |
| 2021-03-07 09:05:24 | 99.996 |
| 2021-03-07 09:05:54 | 99.996 |
| 2021-03-07 09:06:25 | 99.996 |
| 2021-03-07 09:06:56 | 99.996 |
| 2021-03-07 09:07:26 | 99.996 |
| 2021-03-07 09:07:57 | 99.996 |
| 2021-03-07 09:08:28 | 99.996 |
| 2021-03-07 09:08:58 | 99.996 |
| 2021-03-07 09:09:29 | 99.996 |
| 2021-03-07 09:10:00 | 99.996 |
| 2021-03-07 09:10:30 | 99.996 |
| 2021-03-07 09:11:01 | 99.996 |
| 2021-03-07 09:11:32 | 99.996 |
| 2021-03-07 09:12:03 | 99.996 |
| 2021-03-07 09:12:33 | 99.996 |
| 2021-03-07 09:13:04 | 99.996 |
| 2021-03-07 09:13:35 | 99.996 |
| 2021-03-07 09:14:05 | 99.996 |
| 2021-03-07 09:14:36 | 99.996 |
| 2021-03-07 09:15:07 | 99.996 |
| 2021-03-07 09:15:37 | 99.996 |
| 2021-03-07 09:16:08 | 99.996 |
| 2021-03-07 09:16:39 | 99.996 |
| 2021-03-07 09:17:10 | 99.996 |
| 2021-03-07 09:17:40 | 99.996 |
| 2021-03-07 09:18:11 | 99.996 |
| 2021-03-07 09:18:42 | 99.996 |
| 2021-03-07 09:19:12 | 99.996 |
| 2021-03-07 09:19:43 | 99.996 |
| 2021-03-07 09:20:14 | 99.996 |
| 2021-03-07 09:20:44 | 99.996 |
| 2021-03-07 09:21:15 | 99.996 |
| 2021-03-07 09:21:46 | 99.996 |
| 2021-03-07 09:22:16 | 99.996 |
| 2021-03-07 09:22:47 | 99.996 |
| 2021-03-07 09:23:18 | 99.996 |
| 2021-03-07 09:23:49 | 99.996 |
| 2021-03-07 09:24:19 | 99.996 |
| 2021-03-07 09:24:50 | 99.996 |
| 2021-03-07 09:25:21 | 99.996 |
| 2021-03-07 09:25:51 | 99.996 |
| 2021-03-07 09:26:22 | 99.996 |
| 2021-03-07 09:26:53 | 99.996 |
| 2021-03-07 09:27:23 | 99.996 |
| 2021-03-07 09:27:54 | 99.996 |
| 2021-03-07 09:28:25 | 99.996 |
| 2021-03-07 09:28:55 | 99.996 |
| 2021-03-07 09:29:26 | 99.996 |
| 2021-03-07 09:29:57 | 99.996 |
| 2021-03-07 09:30:28 | 99.996 |
| 2021-03-07 09:30:58 | 99.996 |
| 2021-03-07 09:31:29 | 99.996 |
| 2021-03-07 09:32:00 | 99.996 |
| 2021-03-07 09:32:30 | 99.996 |
| 2021-03-07 09:33:01 | 99.996 |
| 2021-03-07 09:33:32 | 99.996 |
| 2021-03-07 09:34:02 | 99.996 |
| 2021-03-07 09:34:33 | 99.996 |
| 2021-03-07 09:35:04 | 99.996 |
| 2021-03-07 09:35:35 | 99.996 |
| 2021-03-07 09:36:05 | 99.996 |
| 2021-03-07 09:36:36 | 99.996 |
| 2021-03-07 09:37:07 | 99.996 |
| 2021-03-07 09:37:37 | 99.996 |
| 2021-03-07 09:38:08 | 99.996 |
| 2021-03-07 09:38:39 | 99.996 |
| 2021-03-07 09:39:09 | 99.996 |
| 2021-03-07 09:39:40 | 99.996 |
| 2021-03-07 09:40:11 | 99.996 |
| 2021-03-07 09:40:42 | 99.996 |
| 2021-03-07 09:41:12 | 99.996 |
| 2021-03-07 09:41:43 | 99.996 |
| 2021-03-07 09:42:14 | 99.996 |
| 2021-03-07 09:42:44 | 99.996 |
| 2021-03-07 09:43:15 | 99.996 |
| 2021-03-07 09:43:46 | 99.996 |
| 2021-03-07 09:44:16 | 99.996 |
| 2021-03-07 09:44:47 | 99.996 |
| 2021-03-07 09:45:18 | 99.996 |
| 2021-03-07 09:45:49 | 99.996 |
| 2021-03-07 09:46:19 | 99.996 |
| 2021-03-07 09:46:50 | 99.996 |
| 2021-03-07 09:47:21 | 99.996 |
| 2021-03-07 09:47:51 | 99.996 |
| 2021-03-07 09:48:22 | 99.996 |
| 2021-03-07 09:48:53 | 99.996 |
| 2021-03-07 09:49:23 | 99.996 |
| 2021-03-07 09:49:54 | 99.996 |
| 2021-03-07 09:50:25 | 99.996 |
| 2021-03-07 09:50:55 | 99.996 |
| 2021-03-07 09:51:26 | 99.996 |
| 2021-03-07 09:51:57 | 99.996 |
| 2021-03-07 09:52:28 | 99.996 |
| 2021-03-07 09:52:58 | 99.996 |
| 2021-03-07 09:53:29 | 99.996 |
| 2021-03-07 09:54:00 | 99.996 |
| 2021-03-07 09:54:30 | 99.996 |
| 2021-03-07 09:55:01 | 99.996 |
| 2021-03-07 09:55:32 | 99.996 |
| 2021-03-07 09:56:02 | 99.996 |
| 2021-03-07 09:56:33 | 99.996 |
| 2021-03-07 09:57:04 | 99.996 |
| 2021-03-07 09:57:34 | 99.996 |
| 2021-03-07 09:58:05 | 99.996 |
| 2021-03-07 09:58:36 | 99.996 |
| 2021-03-07 09:59:07 | 99.996 |
| 2021-03-07 09:59:37 | 99.996 |
| 2021-03-07 10:00:08 | 99.996 |
| 2021-03-07 10:00:39 | 99.996 |
| 2021-03-07 10:01:09 | 99.996 |
| 2021-03-07 10:01:40 | 99.996 |
| 2021-03-07 10:02:11 | 99.996 |
| 2021-03-07 10:02:41 | 99.996 |
| 2021-03-07 10:03:12 | 99.996 |
| 2021-03-07 10:03:43 | 99.996 |
| 2021-03-07 10:04:13 | 99.996 |
| 2021-03-07 10:04:44 | 99.996 |
| 2021-03-07 10:05:15 | 99.996 |
| 2021-03-07 10:05:46 | 99.996 |
| 2021-03-07 10:06:16 | 99.996 |
| 2021-03-07 10:06:47 | 99.996 |
| 2021-03-07 10:07:18 | 99.996 |
| 2021-03-07 10:07:48 | 99.996 |
| 2021-03-07 10:08:19 | 99.996 |
| 2021-03-07 10:08:50 | 99.996 |
| 2021-03-07 10:09:20 | 99.996 |
| 2021-03-07 10:09:51 | 99.996 |
| 2021-03-07 10:10:22 | 99.996 |
| 2021-03-07 10:10:52 | 99.996 |
| 2021-03-07 10:11:23 | 99.996 |
| 2021-03-07 10:11:54 | 99.996 |
| 2021-03-07 10:12:25 | 99.996 |
| 2021-03-07 10:12:55 | 99.996 |
| 2021-03-07 10:13:26 | 99.996 |
| 2021-03-07 10:13:57 | 99.996 |
| 2021-03-07 10:14:27 | 99.996 |
| 2021-03-07 10:14:58 | 99.996 |
| 2021-03-07 10:15:29 | 99.996 |
| 2021-03-07 10:15:59 | 99.996 |
| 2021-03-07 10:16:30 | 99.996 |
| 2021-03-07 10:17:01 | 99.996 |
| 2021-03-07 10:17:31 | 99.996 |
| 2021-03-07 10:18:02 | 99.996 |
| 2021-03-07 10:18:33 | 99.996 |
| 2021-03-07 10:19:04 | 99.996 |
| 2021-03-07 10:19:34 | 99.996 |
| 2021-03-07 10:20:05 | 99.996 |
| 2021-03-07 10:20:36 | 99.996 |
| 2021-03-07 10:21:06 | 99.996 |
| 2021-03-07 10:21:37 | 99.996 |
| 2021-03-07 10:22:08 | 99.996 |
| 2021-03-07 10:22:38 | 99.996 |
| 2021-03-07 10:23:09 | 99.996 |
| 2021-03-07 10:23:40 | 99.996 |
| 2021-03-07 10:24:10 | 99.996 |
| 2021-03-07 10:24:41 | 99.996 |
| 2021-03-07 10:25:12 | 99.996 |
| 2021-03-07 10:25:43 | 99.996 |
| 2021-03-07 10:26:13 | 99.996 |
| 2021-03-07 10:26:44 | 99.996 |
| 2021-03-07 10:27:15 | 99.996 |
| 2021-03-07 10:27:45 | 99.996 |
| 2021-03-07 10:28:16 | 99.996 |
| 2021-03-07 10:28:47 | 99.996 |
| 2021-03-07 10:29:17 | 99.996 |
| 2021-03-07 10:29:48 | 99.996 |
| 2021-03-07 10:30:19 | 99.996 |
| 2021-03-07 10:30:49 | 99.996 |
| 2021-03-07 10:31:20 | 99.996 |
| 2021-03-07 10:31:51 | 99.996 |
| 2021-03-07 10:32:22 | 99.996 |
| 2021-03-07 10:32:52 | 99.996 |
| 2021-03-07 10:33:23 | 99.996 |
| 2021-03-07 10:33:54 | 99.996 |
| 2021-03-07 10:34:24 | 99.996 |
| 2021-03-07 10:34:55 | 99.996 |
| 2021-03-07 10:35:26 | 99.996 |
| 2021-03-07 10:35:56 | 99.996 |
| 2021-03-07 10:36:27 | 99.996 |
| 2021-03-07 10:36:58 | 99.996 |
| 2021-03-07 10:37:29 | 99.996 |
| 2021-03-07 10:37:59 | 99.996 |
| 2021-03-07 10:38:30 | 99.996 |
| 2021-03-07 10:39:01 | 99.996 |
| 2021-03-07 10:39:31 | 99.996 |
| 2021-03-07 10:40:02 | 99.996 |
| 2021-03-07 10:40:33 | 99.996 |
| 2021-03-07 10:41:03 | 99.996 |
| 2021-03-07 10:41:34 | 99.996 |
| 2021-03-07 10:42:05 | 99.996 |
| 2021-03-07 10:42:35 | 99.996 |
| 2021-03-07 10:43:06 | 99.996 |
| 2021-03-07 10:43:37 | 99.996 |
| 2021-03-07 10:44:08 | 99.996 |
| 2021-03-07 10:44:38 | 99.996 |
| 2021-03-07 10:45:09 | 99.996 |
| 2021-03-07 10:45:40 | 99.996 |
| 2021-03-07 10:46:10 | 99.996 |
| 2021-03-07 10:46:41 | 99.996 |
| 2021-03-07 10:47:12 | 99.996 |
| 2021-03-07 10:47:42 | 99.996 |
| 2021-03-07 10:48:13 | 99.996 |
| 2021-03-07 10:48:44 | 99.996 |
| 2021-03-07 10:49:14 | 99.996 |
| 2021-03-07 10:49:45 | 99.996 |
| 2021-03-07 10:50:16 | 99.996 |
| 2021-03-07 10:50:47 | 99.996 |
| 2021-03-07 10:51:17 | 99.996 |
| 2021-03-07 10:51:48 | 99.996 |
| 2021-03-07 10:52:19 | 99.996 |
| 2021-03-07 10:52:49 | 99.996 |
| 2021-03-07 10:53:20 | 99.996 |
| 2021-03-07 10:53:51 | 99.996 |
| 2021-03-07 10:54:21 | 99.996 |
| 2021-03-07 10:54:52 | 99.996 |
| 2021-03-07 10:55:23 | 99.996 |
| 2021-03-07 10:55:53 | 99.996 |
| 2021-03-07 10:56:24 | 99.996 |
| 2021-03-07 10:56:55 | 99.996 |
| 2021-03-07 10:57:26 | 99.996 |
| 2021-03-07 10:57:56 | 99.996 |
| 2021-03-07 10:58:27 | 99.996 |
| 2021-03-07 10:58:58 | 99.996 |
| 2021-03-07 10:59:28 | 99.996 |
| 2021-03-07 10:59:59 | 99.996 |
| 2021-03-07 11:00:30 | 99.996 |
| 2021-03-07 11:01:00 | 99.996 |
| 2021-03-07 11:01:31 | 99.996 |
| 2021-03-07 11:02:02 | 99.996 |
| 2021-03-07 11:02:33 | 99.996 |
| 2021-03-07 11:03:03 | 99.996 |
| 2021-03-07 11:03:34 | 99.996 |
| 2021-03-07 11:04:05 | 99.996 |
| 2021-03-07 11:04:35 | 99.996 |
| 2021-03-07 11:05:06 | 99.996 |
| 2021-03-07 11:05:37 | 99.996 |
| 2021-03-07 11:06:07 | 99.996 |
| 2021-03-07 11:06:38 | 99.996 |
| 2021-03-07 11:07:09 | 99.996 |
| 2021-03-07 11:07:39 | 99.996 |
| 2021-03-07 11:08:10 | 99.996 |
| 2021-03-07 11:08:41 | 99.996 |
| 2021-03-07 11:09:12 | 99.996 |
| 2021-03-07 11:09:42 | 99.996 |
| 2021-03-07 11:10:13 | 99.996 |
| 2021-03-07 11:10:44 | 99.996 |
| 2021-03-07 11:11:14 | 99.996 |
| 2021-03-07 11:11:45 | 99.996 |
| 2021-03-07 11:12:16 | 99.996 |
| 2021-03-07 11:12:46 | 99.996 |
| 2021-03-07 11:13:17 | 99.996 |
| 2021-03-07 11:13:48 | 99.996 |
| 2021-03-07 11:14:18 | 99.996 |
| 2021-03-07 11:14:49 | 99.996 |
| 2021-03-07 11:15:20 | 99.996 |
| 2021-03-07 11:15:51 | 99.996 |
| 2021-03-07 11:16:21 | 99.996 |
| 2021-03-07 11:16:52 | 99.996 |
| 2021-03-07 11:17:23 | 99.996 |
| 2021-03-07 11:17:53 | 99.996 |
| 2021-03-07 11:18:24 | 99.996 |
| 2021-03-07 11:18:55 | 99.996 |
| 2021-03-07 11:19:25 | 99.996 |
| 2021-03-07 11:19:56 | 99.996 |
| 2021-03-07 11:20:27 | 99.996 |
| 2021-03-07 11:20:57 | 99.996 |
| 2021-03-07 11:21:28 | 99.996 |
| 2021-03-07 11:21:59 | 99.996 |
| 2021-03-07 11:22:30 | 99.996 |
| 2021-03-07 11:23:00 | 99.996 |
| 2021-03-07 11:23:31 | 99.996 |
| 2021-03-07 11:24:02 | 99.996 |
| 2021-03-07 11:24:32 | 99.996 |
| 2021-03-07 11:25:03 | 99.996 |
| 2021-03-07 11:25:34 | 99.996 |
| 2021-03-07 11:26:04 | 99.996 |
| 2021-03-07 11:26:35 | 99.996 |
| 2021-03-07 11:27:06 | 99.996 |
| 2021-03-07 11:27:36 | 99.996 |
| 2021-03-07 11:28:07 | 99.996 |
| 2021-03-07 11:28:38 | 99.996 |
| 2021-03-07 11:29:09 | 99.996 |
| 2021-03-07 11:29:39 | 99.996 |
| 2021-03-07 11:30:10 | 99.996 |
| 2021-03-07 11:30:41 | 99.996 |
| 2021-03-07 11:31:11 | 99.996 |
| 2021-03-07 11:31:42 | 99.996 |
| 2021-03-07 11:32:13 | 99.996 |
| 2021-03-07 11:32:43 | 99.996 |
| 2021-03-07 11:33:14 | 99.996 |
| 2021-03-07 11:33:45 | 99.996 |
| 2021-03-07 11:34:16 | 99.996 |
| 2021-03-07 11:34:46 | 99.996 |
| 2021-03-07 11:35:17 | 99.996 |
| 2021-03-07 11:35:48 | 99.996 |
| 2021-03-07 11:36:18 | 99.996 |
| 2021-03-07 11:36:49 | 99.996 |
| 2021-03-07 11:37:20 | 99.996 |
| 2021-03-07 11:37:50 | 99.996 |
| 2021-03-07 11:38:21 | 99.996 |
| 2021-03-07 11:38:52 | 99.996 |
| 2021-03-07 11:39:22 | 99.996 |
| 2021-03-07 11:39:53 | 99.996 |
| 2021-03-07 11:40:24 | 99.996 |
| 2021-03-07 11:40:55 | 99.996 |
| 2021-03-07 11:41:25 | 99.996 |
| 2021-03-07 11:41:56 | 99.996 |
| 2021-03-07 11:42:27 | 99.996 |
| 2021-03-07 11:42:57 | 99.996 |
| 2021-03-07 11:43:28 | 99.996 |
| 2021-03-07 11:43:59 | 99.996 |
| 2021-03-07 11:44:29 | 99.996 |
| 2021-03-07 11:45:00 | 99.996 |
| 2021-03-07 11:45:31 | 99.996 |
| 2021-03-07 11:46:01 | 99.996 |
| 2021-03-07 11:46:32 | 99.996 |
| 2021-03-07 11:47:03 | 99.996 |
| 2021-03-07 11:47:34 | 99.996 |
| 2021-03-07 11:48:04 | 99.996 |
| 2021-03-07 11:48:35 | 99.996 |
| 2021-03-07 11:49:06 | 99.996 |
| 2021-03-07 11:49:36 | 99.996 |
| 2021-03-07 11:50:07 | 99.996 |
| 2021-03-07 11:50:38 | 99.996 |
| 2021-03-07 11:51:08 | 99.996 |
| 2021-03-07 11:51:39 | 99.996 |
| 2021-03-07 11:52:10 | 99.996 |
| 2021-03-07 11:52:41 | 99.996 |
| 2021-03-07 11:53:11 | 99.996 |
| 2021-03-07 11:53:42 | 99.996 |
| 2021-03-07 11:54:13 | 99.996 |
| 2021-03-07 11:54:43 | 99.996 |
| 2021-03-07 11:55:14 | 99.996 |
| 2021-03-07 11:55:45 | 99.996 |
| 2021-03-07 11:56:15 | 99.996 |
| 2021-03-07 11:56:46 | 99.996 |
| 2021-03-07 11:57:17 | 99.996 |
| 2021-03-07 11:57:47 | 99.996 |
| 2021-03-07 11:58:18 | 99.996 |
| 2021-03-07 11:58:49 | 99.996 |
| 2021-03-07 11:59:20 | 99.996 |
| 2021-03-07 11:59:50 | 99.996 |
| 2021-03-07 12:00:21 | 99.996 |
| 2021-03-07 12:00:52 | 99.996 |
| 2021-03-07 12:01:22 | 99.996 |
| 2021-03-07 12:01:53 | 99.996 |
| 2021-03-07 12:02:24 | 99.996 |
| 2021-03-07 12:02:54 | 99.996 |
| 2021-03-07 12:03:25 | 99.996 |
| 2021-03-07 12:03:56 | 99.996 |
| 2021-03-07 12:04:26 | 99.996 |
| 2021-03-07 12:04:57 | 99.996 |
| 2021-03-07 12:05:28 | 99.996 |
| 2021-03-07 12:05:59 | 99.996 |
| 2021-03-07 12:06:29 | 99.996 |
| 2021-03-07 12:07:00 | 99.996 |
| 2021-03-07 12:07:31 | 99.996 |
| 2021-03-07 12:08:01 | 99.996 |
| 2021-03-07 12:08:32 | 99.996 |
| 2021-03-07 12:09:03 | 99.996 |
| 2021-03-07 12:09:33 | 99.996 |
| 2021-03-07 12:10:04 | 99.996 |
| 2021-03-07 12:10:35 | 99.996 |
| 2021-03-07 12:11:06 | 99.996 |
| 2021-03-07 12:11:36 | 99.996 |
| 2021-03-07 12:12:07 | 99.996 |
| 2021-03-07 12:12:38 | 99.996 |
| 2021-03-07 12:13:08 | 99.996 |
| 2021-03-07 12:13:39 | 99.996 |
| 2021-03-07 12:14:10 | 99.996 |
| 2021-03-07 12:14:40 | 99.996 |
| 2021-03-07 12:15:11 | 99.996 |
| 2021-03-07 12:15:42 | 99.996 |
| 2021-03-07 12:16:12 | 99.996 |
| 2021-03-07 12:16:43 | 99.996 |
| 2021-03-07 12:17:14 | 99.996 |
| 2021-03-07 12:17:45 | 99.996 |
| 2021-03-07 12:18:15 | 99.996 |
| 2021-03-07 12:18:46 | 99.996 |
| 2021-03-07 12:19:17 | 99.996 |
| 2021-03-07 12:19:47 | 99.996 |
| 2021-03-07 12:20:18 | 99.996 |
| 2021-03-07 12:20:49 | 99.996 |
| 2021-03-07 12:21:19 | 99.996 |
| 2021-03-07 12:21:50 | 99.996 |
| 2021-03-07 12:22:21 | 99.996 |
| 2021-03-07 12:22:52 | 99.996 |
| 2021-03-07 12:23:22 | 99.996 |
| 2021-03-07 12:23:53 | 99.996 |
| 2021-03-07 12:24:24 | 99.996 |
| 2021-03-07 12:24:54 | 99.996 |
| 2021-03-07 12:25:25 | 99.996 |
| 2021-03-07 12:25:56 | 99.996 |
| 2021-03-07 12:26:26 | 99.996 |
| 2021-03-07 12:26:57 | 99.996 |
| 2021-03-07 12:27:28 | 99.996 |
| 2021-03-07 12:27:59 | 99.996 |
| 2021-03-07 12:28:29 | 99.996 |
| 2021-03-07 12:29:00 | 99.996 |
| 2021-03-07 12:29:31 | 99.996 |
| 2021-03-07 12:30:01 | 99.996 |
| 2021-03-07 12:30:32 | 99.996 |
| 2021-03-07 12:31:03 | 99.996 |
| 2021-03-07 12:31:33 | 99.996 |
| 2021-03-07 12:32:04 | 99.996 |
| 2021-03-07 12:32:35 | 99.996 |
| 2021-03-07 12:33:06 | 99.996 |
| 2021-03-07 12:33:36 | 99.996 |
| 2021-03-07 12:34:07 | 99.996 |
| 2021-03-07 12:34:38 | 99.996 |
| 2021-03-07 12:35:08 | 99.996 |
| 2021-03-07 12:35:39 | 99.996 |
| 2021-03-07 12:36:10 | 99.996 |
| 2021-03-07 12:36:40 | 99.996 |
| 2021-03-07 12:37:11 | 99.996 |
| 2021-03-07 12:37:42 | 99.996 |
| 2021-03-07 12:38:12 | 99.996 |
| 2021-03-07 12:38:43 | 99.996 |
| 2021-03-07 12:39:14 | 99.996 |
| 2021-03-07 12:39:45 | 99.996 |
| 2021-03-07 12:40:15 | 99.996 |
| 2021-03-07 12:40:46 | 99.996 |
| 2021-03-07 12:41:17 | 99.996 |
| 2021-03-07 12:41:47 | 99.996 |
| 2021-03-07 12:42:18 | 99.996 |
| 2021-03-07 12:42:49 | 99.996 |
| 2021-03-07 12:43:19 | 99.996 |
| 2021-03-07 12:43:50 | 99.996 |
| 2021-03-07 12:44:21 | 99.996 |
| 2021-03-07 12:44:52 | 99.996 |
| 2021-03-07 12:45:22 | 99.996 |
| 2021-03-07 12:45:53 | 99.996 |
| 2021-03-07 12:46:24 | 99.996 |
| 2021-03-07 12:46:54 | 99.996 |
| 2021-03-07 12:47:25 | 99.996 |
| 2021-03-07 12:47:56 | 99.996 |
| 2021-03-07 12:48:26 | 99.996 |
| 2021-03-07 12:48:57 | 99.996 |
| 2021-03-07 12:49:28 | 99.996 |
| 2021-03-07 12:49:59 | 99.996 |
| 2021-03-07 12:50:29 | 99.996 |
| 2021-03-07 12:51:00 | 99.996 |
| 2021-03-07 12:51:31 | 99.996 |
| 2021-03-07 12:52:01 | 99.996 |
| 2021-03-07 12:52:32 | 99.996 |
| 2021-03-07 12:53:03 | 99.996 |
| 2021-03-07 12:53:33 | 99.996 |
| 2021-03-07 12:54:04 | 99.996 |
| 2021-03-07 12:54:35 | 99.996 |
| 2021-03-07 12:55:05 | 99.996 |
| 2021-03-07 12:55:36 | 99.996 |
| 2021-03-07 12:56:07 | 99.996 |
| 2021-03-07 12:56:38 | 99.996 |
| 2021-03-07 12:57:08 | 99.996 |
| 2021-03-07 12:57:39 | 99.996 |
| 2021-03-07 12:58:10 | 99.996 |
| 2021-03-07 12:58:40 | 99.996 |
| 2021-03-07 12:59:11 | 99.996 |
| 2021-03-07 12:59:42 | 99.996 |
| 2021-03-07 13:00:12 | 99.996 |
| 2021-03-07 13:00:43 | 99.996 |
| 2021-03-07 13:01:14 | 99.996 |
| 2021-03-07 13:01:45 | 99.996 |
| 2021-03-07 13:02:15 | 99.996 |
| 2021-03-07 13:02:46 | 99.996 |
| 2021-03-07 13:03:17 | 99.996 |
| 2021-03-07 13:03:47 | 99.996 |
| 2021-03-07 13:04:18 | 99.996 |
| 2021-03-07 13:04:49 | 99.996 |
| 2021-03-07 13:05:19 | 99.996 |
| 2021-03-07 13:05:50 | 99.996 |
| 2021-03-07 13:06:21 | 99.996 |
| 2021-03-07 13:06:52 | 99.996 |
| 2021-03-07 13:07:22 | 99.996 |
| 2021-03-07 13:07:53 | 99.996 |
| 2021-03-07 13:08:24 | 99.996 |
| 2021-03-07 13:08:54 | 99.996 |
| 2021-03-07 13:09:25 | 99.996 |
| 2021-03-07 13:09:56 | 99.996 |
| 2021-03-07 13:10:26 | 99.996 |
| 2021-03-07 13:10:57 | 99.996 |
| 2021-03-07 13:11:28 | 99.996 |
| 2021-03-07 13:11:58 | 99.996 |
| 2021-03-07 13:12:29 | 99.996 |
| 2021-03-07 13:13:00 | 99.996 |
| 2021-03-07 13:13:31 | 99.996 |
| 2021-03-07 13:14:01 | 99.996 |
| 2021-03-07 13:14:32 | 99.996 |
| 2021-03-07 13:15:03 | 99.996 |
| 2021-03-07 13:15:33 | 99.996 |
| 2021-03-07 13:16:04 | 99.996 |
| 2021-03-07 13:16:35 | 99.996 |
| 2021-03-07 13:17:05 | 99.996 |
| 2021-03-07 13:17:36 | 99.996 |
| 2021-03-07 13:18:07 | 99.996 |
| 2021-03-07 13:18:37 | 99.996 |
| 2021-03-07 13:19:08 | 99.996 |
| 2021-03-07 13:19:39 | 99.996 |
| 2021-03-07 13:20:10 | 99.996 |
| 2021-03-07 13:20:40 | 99.996 |
| 2021-03-07 13:21:11 | 99.996 |
| 2021-03-07 13:21:42 | 99.996 |
| 2021-03-07 13:22:12 | 99.996 |
| 2021-03-07 13:22:43 | 99.996 |
| 2021-03-07 13:23:14 | 99.996 |
| 2021-03-07 13:23:44 | 99.996 |
| 2021-03-07 13:24:15 | 99.996 |
| 2021-03-07 13:24:46 | 99.996 |
| 2021-03-07 13:25:17 | 99.996 |
| 2021-03-07 13:25:47 | 99.996 |
| 2021-03-07 13:26:18 | 99.996 |
| 2021-03-07 13:26:49 | 99.996 |
| 2021-03-07 13:27:19 | 99.996 |
| 2021-03-07 13:27:50 | 99.996 |